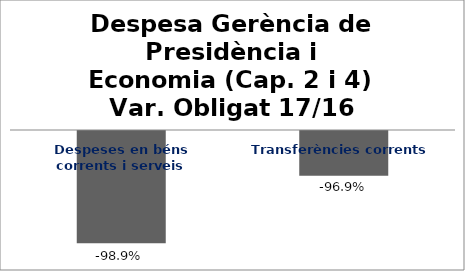
| Category | Series 0 |
|---|---|
| Despeses en béns corrents i serveis | -0.989 |
| Transferències corrents | -0.969 |